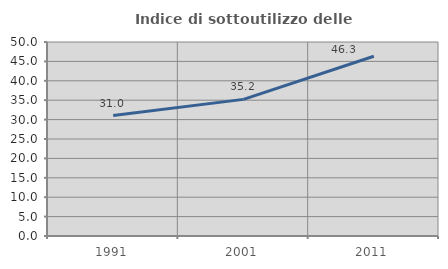
| Category | Indice di sottoutilizzo delle abitazioni  |
|---|---|
| 1991.0 | 31.048 |
| 2001.0 | 35.211 |
| 2011.0 | 46.326 |